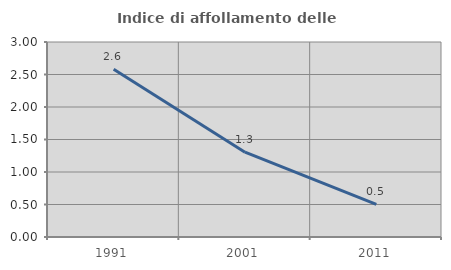
| Category | Indice di affollamento delle abitazioni  |
|---|---|
| 1991.0 | 2.581 |
| 2001.0 | 1.304 |
| 2011.0 | 0.503 |